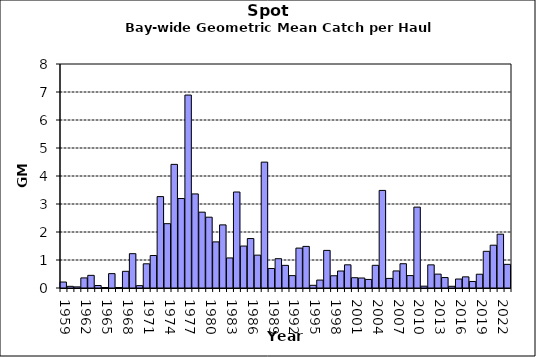
| Category | Series 0 |
|---|---|
| 1959.0 | 0.213 |
| 1960.0 | 0.059 |
| 1961.0 | 0.04 |
| 1962.0 | 0.36 |
| 1963.0 | 0.452 |
| 1964.0 | 0.088 |
| 1965.0 | 0.016 |
| 1966.0 | 0.513 |
| 1967.0 | 0.018 |
| 1968.0 | 0.596 |
| 1969.0 | 1.226 |
| 1970.0 | 0.084 |
| 1971.0 | 0.864 |
| 1972.0 | 1.16 |
| 1973.0 | 3.264 |
| 1974.0 | 2.297 |
| 1975.0 | 4.416 |
| 1976.0 | 3.195 |
| 1977.0 | 6.891 |
| 1978.0 | 3.36 |
| 1979.0 | 2.708 |
| 1980.0 | 2.529 |
| 1981.0 | 1.647 |
| 1982.0 | 2.254 |
| 1983.0 | 1.074 |
| 1984.0 | 3.428 |
| 1985.0 | 1.498 |
| 1986.0 | 1.766 |
| 1987.0 | 1.174 |
| 1988.0 | 4.495 |
| 1989.0 | 0.697 |
| 1990.0 | 1.046 |
| 1991.0 | 0.809 |
| 1992.0 | 0.441 |
| 1993.0 | 1.425 |
| 1994.0 | 1.486 |
| 1995.0 | 0.096 |
| 1996.0 | 0.283 |
| 1997.0 | 1.343 |
| 1998.0 | 0.437 |
| 1999.0 | 0.607 |
| 2000.0 | 0.828 |
| 2001.0 | 0.367 |
| 2002.0 | 0.357 |
| 2003.0 | 0.306 |
| 2004.0 | 0.81 |
| 2005.0 | 3.485 |
| 2006.0 | 0.342 |
| 2007.0 | 0.609 |
| 2008.0 | 0.867 |
| 2009.0 | 0.443 |
| 2010.0 | 2.889 |
| 2011.0 | 0.065 |
| 2012.0 | 0.827 |
| 2013.0 | 0.496 |
| 2014.0 | 0.373 |
| 2015.0 | 0.061 |
| 2016.0 | 0.321 |
| 2017.0 | 0.398 |
| 2018.0 | 0.233 |
| 2019.0 | 0.492 |
| 2020.0 | 1.31 |
| 2021.0 | 1.528 |
| 2022.0 | 1.922 |
| 2023.0 | 0.844 |